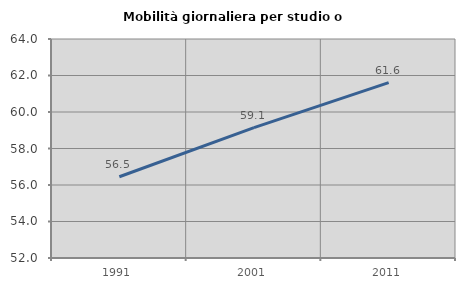
| Category | Mobilità giornaliera per studio o lavoro |
|---|---|
| 1991.0 | 56.452 |
| 2001.0 | 59.147 |
| 2011.0 | 61.613 |